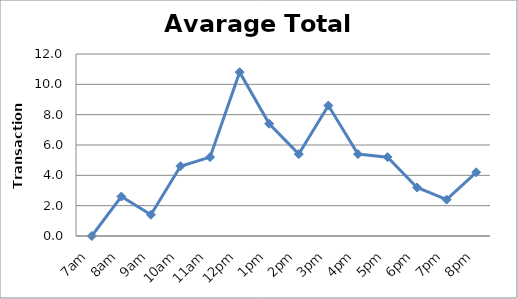
| Category | Series 0 |
|---|---|
| 7am | 0 |
| 8am | 2.6 |
| 9am | 1.4 |
| 10am | 4.6 |
| 11am | 5.2 |
| 12pm | 10.8 |
| 1pm | 7.4 |
| 2pm | 5.4 |
| 3pm | 8.6 |
| 4pm | 5.4 |
| 5pm | 5.2 |
| 6pm | 3.2 |
| 7pm | 2.4 |
| 8pm | 4.2 |